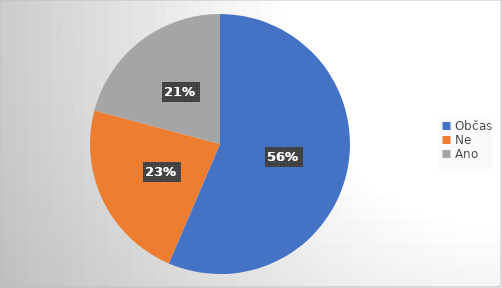
| Category | Series 0 |
|---|---|
| Občas | 92 |
| Ne | 37 |
| Ano | 34 |